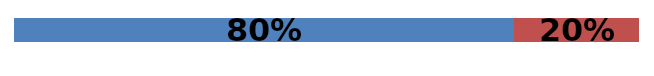
| Category | Series 0 | Series 1 | Series 2 |
|---|---|---|---|
| 0 | 0.8 | 0.2 | 0 |